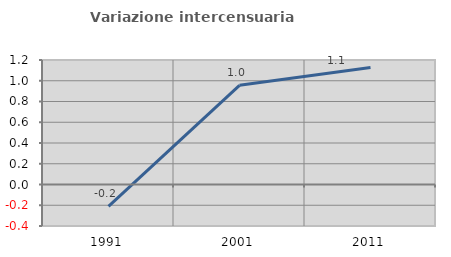
| Category | Variazione intercensuaria annua |
|---|---|
| 1991.0 | -0.211 |
| 2001.0 | 0.956 |
| 2011.0 | 1.127 |